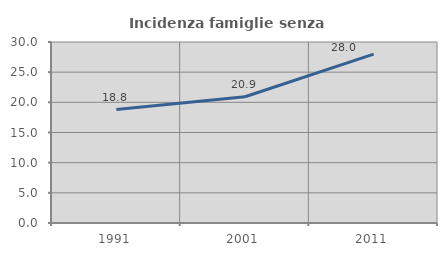
| Category | Incidenza famiglie senza nuclei |
|---|---|
| 1991.0 | 18.807 |
| 2001.0 | 20.93 |
| 2011.0 | 28 |